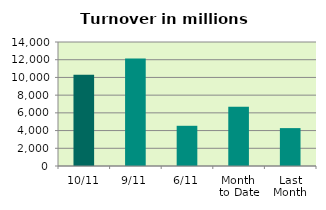
| Category | Series 0 |
|---|---|
| 10/11 | 10300.008 |
| 9/11 | 12147.676 |
| 6/11 | 4539.758 |
| Month 
to Date | 6701.162 |
| Last
Month | 4277.774 |